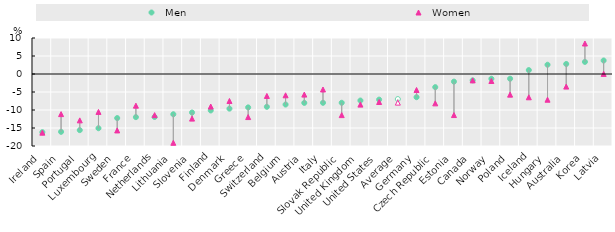
| Category |   Men |   Women |
|---|---|---|
| Ireland | -16.163 | -16.297 |
| Spain | -16.063 | -11.139 |
| Portugal | -15.591 | -12.881 |
| Luxembourg | -15.066 | -10.533 |
| Sweden | -12.243 | -15.676 |
| France | -11.979 | -8.789 |
| Netherlands | -11.944 | -11.423 |
| Lithuania | -11.184 | -19.112 |
| Slovenia | -10.694 | -12.392 |
| Finland | -10.129 | -9.035 |
| Denmark | -9.625 | -7.494 |
| Greece | -9.272 | -11.962 |
| Switzerland | -9.117 | -6.096 |
| Belgium | -8.479 | -5.918 |
| Austria | -8.029 | -5.72 |
| Italy | -8.002 | -4.305 |
| Slovak Republic | -7.992 | -11.423 |
| United Kingdom | -7.374 | -8.506 |
| United States | -7.114 | -7.781 |
| Average | -6.97 | -7.951 |
| Germany | -6.443 | -4.438 |
| Czech Republic | -3.652 | -8.158 |
| Estonia | -2.117 | -11.405 |
| Canada | -1.764 | -1.774 |
| Norway | -1.321 | -1.941 |
| Poland | -1.311 | -5.729 |
| Iceland | 1.086 | -6.471 |
| Hungary | 2.573 | -7.142 |
| Australia | 2.788 | -3.497 |
| Korea | 3.365 | 8.47 |
| Latvia | 3.749 | 0.03 |